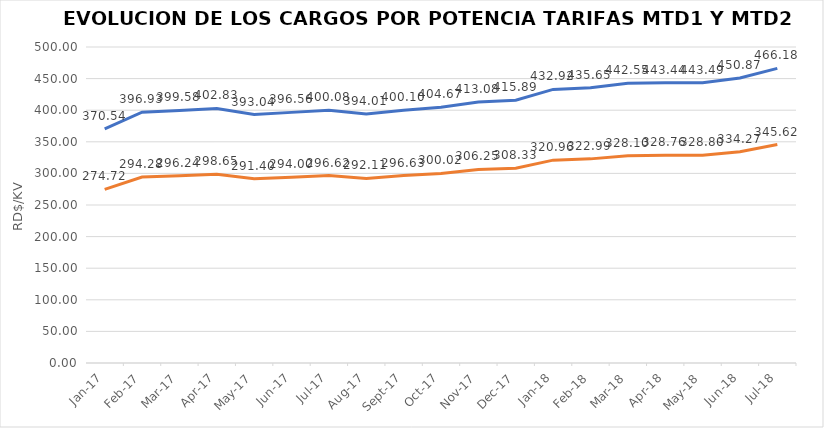
| Category | Series 0 | Series 1 |
|---|---|---|
| 2017-01-01 | 370.544 | 274.717 |
| 2017-02-01 | 396.93 | 294.28 |
| 2017-03-01 | 399.579 | 296.243 |
| 2017-04-01 | 402.83 | 298.65 |
| 2017-05-01 | 393.04 | 291.4 |
| 2017-06-01 | 396.555 | 294.002 |
| 2017-07-01 | 400.08 | 296.62 |
| 2017-08-01 | 394.007 | 292.112 |
| 2017-09-01 | 400.096 | 296.627 |
| 2017-10-01 | 404.673 | 300.02 |
| 2017-11-01 | 413.079 | 306.252 |
| 2017-12-01 | 415.887 | 308.334 |
| 2018-01-01 | 432.921 | 320.963 |
| 2018-02-01 | 435.65 | 322.99 |
| 2018-03-01 | 442.548 | 328.1 |
| 2018-04-01 | 443.441 | 328.763 |
| 2018-05-01 | 443.49 | 328.8 |
| 2018-06-01 | 450.875 | 334.273 |
| 2018-07-01 | 466.183 | 345.623 |